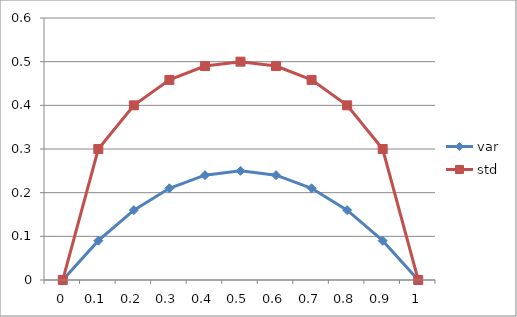
| Category | var | std |
|---|---|---|
| 0.0 | 0 | 0 |
| 0.1 | 0.09 | 0.3 |
| 0.2 | 0.16 | 0.4 |
| 0.3 | 0.21 | 0.458 |
| 0.4 | 0.24 | 0.49 |
| 0.5 | 0.25 | 0.5 |
| 0.6 | 0.24 | 0.49 |
| 0.7 | 0.21 | 0.458 |
| 0.8 | 0.16 | 0.4 |
| 0.9 | 0.09 | 0.3 |
| 1.0 | 0 | 0 |